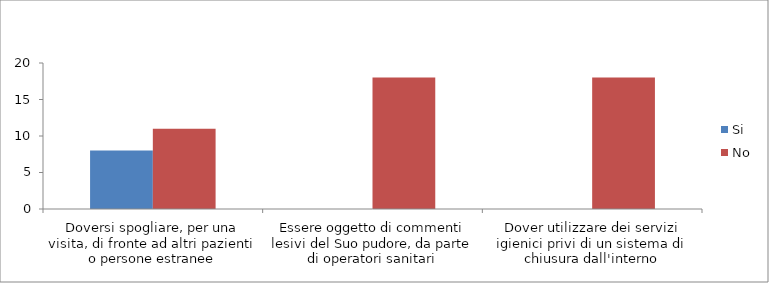
| Category | Si | No |
|---|---|---|
| Doversi spogliare, per una visita, di fronte ad altri pazienti o persone estranee | 8 | 11 |
| Essere oggetto di commenti lesivi del Suo pudore, da parte di operatori sanitari | 0 | 18 |
| Dover utilizzare dei servizi igienici privi di un sistema di chiusura dall'interno | 0 | 18 |